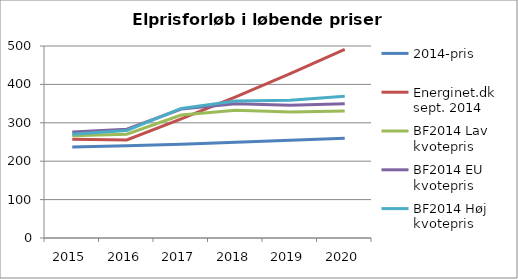
| Category | 2014-pris | Energinet.dk sept. 2014 | BF2014 Lav kvotepris | BF2014 EU kvotepris | BF2014 Høj kvotepris |
|---|---|---|---|---|---|
| 2015.0 | 236.803 | 257.201 | 266.275 | 276.176 | 270.388 |
| 2016.0 | 240.138 | 255.294 | 270.165 | 283.461 | 280.15 |
| 2017.0 | 244.351 | 310.299 | 320.381 | 335.924 | 337.444 |
| 2018.0 | 249.073 | 367.796 | 332.47 | 349.445 | 356.936 |
| 2019.0 | 254.438 | 428.329 | 328.37 | 345.865 | 358.445 |
| 2020.0 | 259.877 | 491.22 | 330.429 | 349.429 | 369.35 |